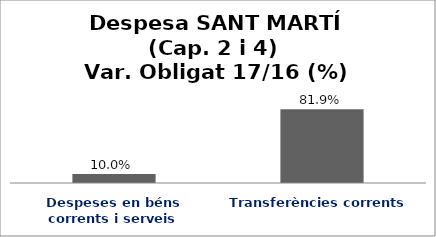
| Category | Series 0 |
|---|---|
| Despeses en béns corrents i serveis | 0.1 |
| Transferències corrents | 0.819 |